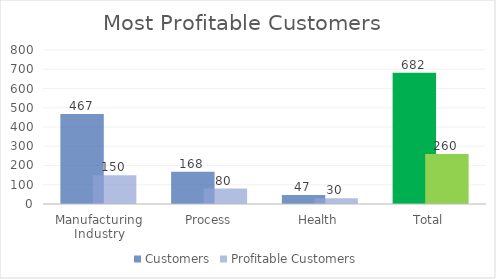
| Category | Customers | Profitable Customers |
|---|---|---|
| Manufacturing Industry | 467 | 150 |
| Process | 168 | 80 |
| Health | 47 | 30 |
| Total | 682 | 260 |